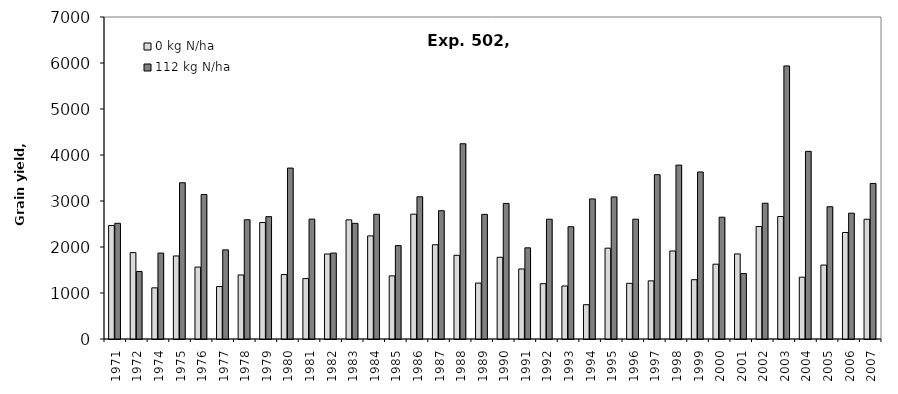
| Category | 0 kg N/ha | 112 kg N/ha |
|---|---|---|
| 1971.0 | 2467.92 | 2514.96 |
| 1972.0 | 1878.24 | 1467.648 |
| 1974.0 | 1111.942 | 1868.143 |
| 1975.0 | 1805.126 | 3396.809 |
| 1976.0 | 1563.223 | 3140.676 |
| 1977.0 | 1140.401 | 1937.258 |
| 1978.0 | 1392.468 | 2591.82 |
| 1979.0 | 2531.76 | 2659.944 |
| 1980.0 | 1400.616 | 3715.992 |
| 1981.0 | 1313.256 | 2606.184 |
| 1982.0 | 1847.832 | 1868.16 |
| 1983.0 | 2589.72 | 2514.456 |
| 1984.0 | 2242.128 | 2711.52 |
| 1985.0 | 1372.056 | 2030.784 |
| 1986.0 | 2713.704 | 3091.872 |
| 1987.0 | 2049.096 | 2788.968 |
| 1988.0 | 1819.272 | 4244.352 |
| 1989.0 | 1215.648 | 2709.672 |
| 1990.0 | 1776.6 | 2947.56 |
| 1991.0 | 1522.416 | 1981.728 |
| 1992.0 | 1202.198 | 2603.814 |
| 1993.0 | 1152.598 | 2440.58 |
| 1994.0 | 745.428 | 3045.134 |
| 1995.0 | 1974.761 | 3088.265 |
| 1996.0 | 1210.518 | 2604.867 |
| 1997.0 | 1263.879 | 3572.865 |
| 1998.0 | 1912.766 | 3780.124 |
| 1999.0 | 1289.191 | 3630.612 |
| 2000.0 | 1626.686 | 2647.469 |
| 2001.0 | 1849.491 | 1422.245 |
| 2002.0 | 2445.992 | 2951.129 |
| 2003.0 | 2663.402 | 5935.714 |
| 2004.0 | 1344 | 4079.04 |
| 2005.0 | 1607.207 | 2874.786 |
| 2006.0 | 2315.712 | 2735.712 |
| 2007.0 | 2602.656 | 3380.832 |